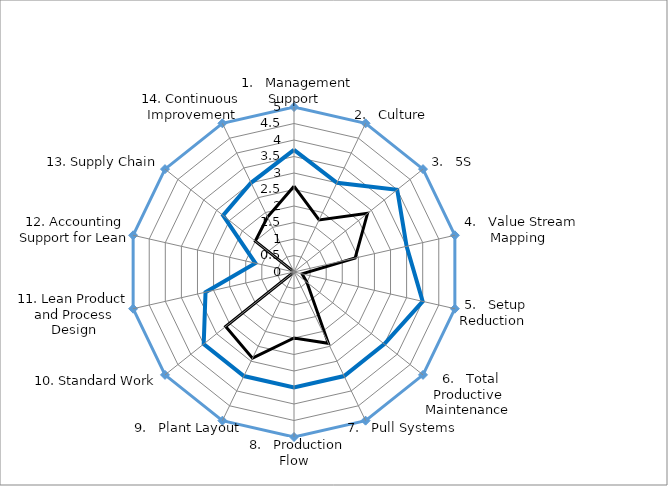
| Category | Series 0 | Assessment FHR 2010 Oct | Tgt for LCL 2011 |
|---|---|---|---|
|   1.   Management Support | 5 | 2.6 | 3.7 |
|   2.   Culture | 5 | 1.75 | 3 |
|   3.   5S | 5 | 2.85 | 4 |
|   4.   Value Stream Mapping | 5 | 1.9 | 3.5 |
|   5.   Setup Reduction | 5 | 0.25 | 4 |
|   6.   Total Productive Maintenance | 5 | 0.5 | 3.5 |
|   7.   Pull Systems | 5 | 2.4 | 3.5 |
|   8.   Production Flow | 5 | 2 | 3.5 |
|   9.   Plant Layout | 5 | 2.9 | 3.5 |
| 10. Standard Work | 5 | 2.65 | 3.5 |
| 11. Lean Product and Process Design | 5 | 0 | 2.75 |
| 12. Accounting Support for Lean | 5 | 0 | 1.2 |
| 13. Supply Chain | 5 | 1.5 | 2.75 |
| 14. Continuous Improvement | 5 | 1.85 | 3 |